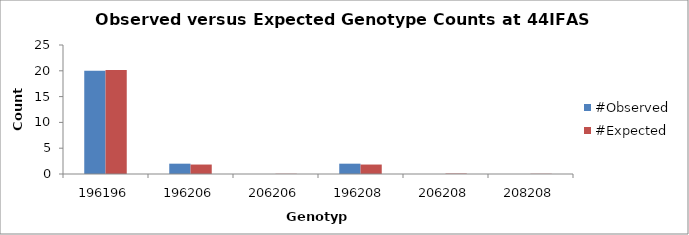
| Category | #Observed | #Expected |
|---|---|---|
| 196196.0 | 20 | 20.167 |
| 196206.0 | 2 | 1.833 |
| 206206.0 | 0 | 0.042 |
| 196208.0 | 2 | 1.833 |
| 206208.0 | 0 | 0.083 |
| 208208.0 | 0 | 0.042 |